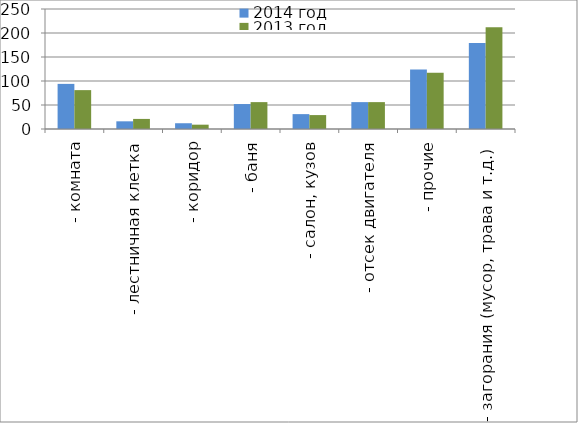
| Category | 2014 год | 2013 год |
|---|---|---|
|  - комната | 94 | 81 |
|  - лестничная клетка | 16 | 21 |
|  - коридор | 12 | 9 |
|  - баня | 52 | 56 |
|  - салон, кузов | 31 | 29 |
|  - отсек двигателя | 56 | 56 |
| - прочие | 124 | 117 |
| - загорания (мусор, трава и т.д.)  | 179 | 212 |